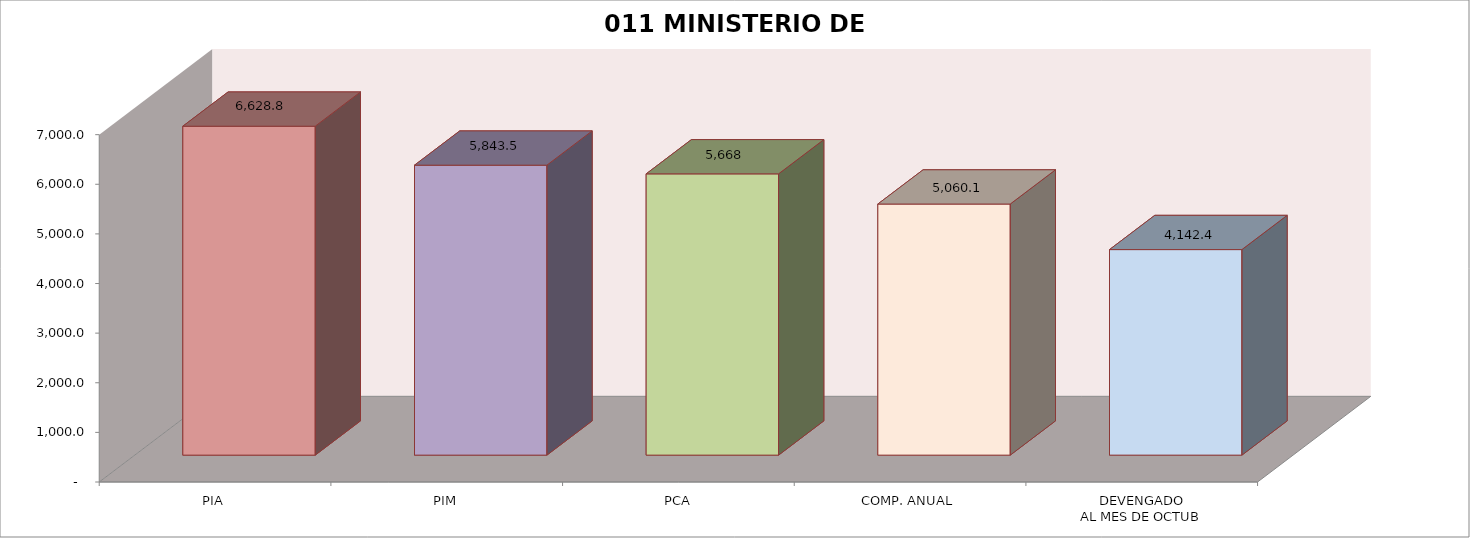
| Category | 011 MINISTERIO DE SALUD |
|---|---|
| PIA | 6628.781 |
| PIM | 5843.54 |
| PCA | 5668.233 |
| COMP. ANUAL | 5060.12 |
| DEVENGADO
AL MES DE OCTUB | 4142.418 |